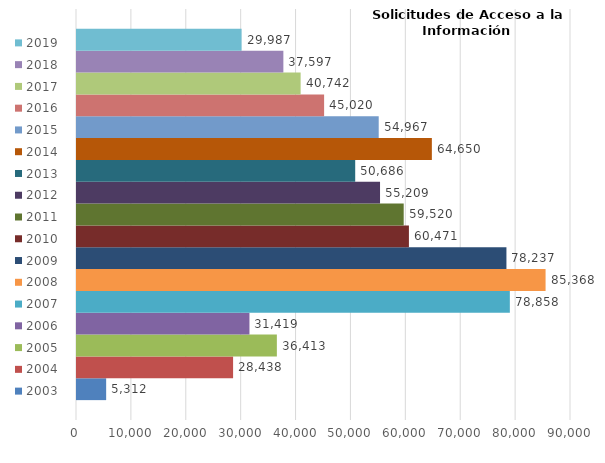
| Category | 2003 | 2004 | 2005 | 2006 | 2007 | 2008 | 2009 | 2010 | 2011 | 2012 | 2013 | 2014 | 2015 | 2016 | 2017 | 2018 | 2019 |
|---|---|---|---|---|---|---|---|---|---|---|---|---|---|---|---|---|---|
| 0 | 5312 | 28438 | 36413 | 31419 | 78858 | 85368 | 78237 | 60471 | 59520 | 55209 | 50686 | 64650 | 54967 | 45020 | 40742 | 37597 | 29987 |